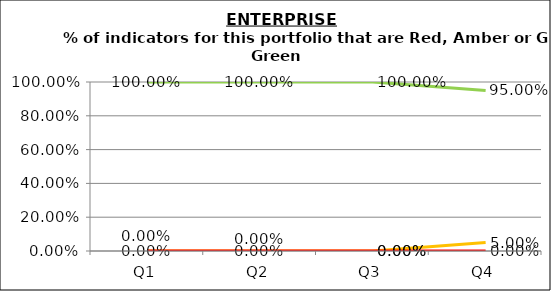
| Category | Green | Amber | Red |
|---|---|---|---|
| Q1 | 1 | 0 | 0 |
| Q2 | 1 | 0 | 0 |
| Q3 | 1 | 0 | 0 |
| Q4 | 0.95 | 0.05 | 0 |